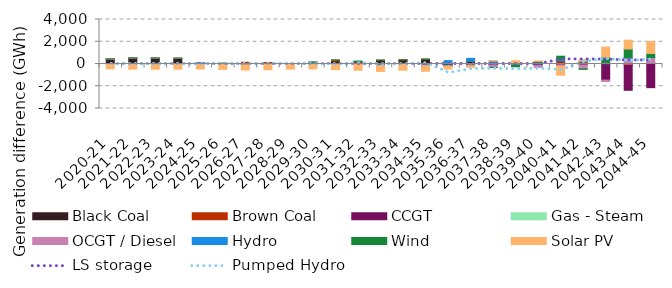
| Category | Black Coal | Brown Coal | CCGT | Gas - Steam | OCGT / Diesel | Hydro | Wind | Solar PV |
|---|---|---|---|---|---|---|---|---|
| 2020-21 | 455.042 | 0.575 | 0.001 | 0 | 0.795 | -4.125 | 0.005 | -427.634 |
| 2021-22 | 542.054 | 1.513 | 0.001 | 0 | 0.002 | -1.081 | 0.006 | -456.438 |
| 2022-23 | 522.702 | 0.621 | 0.639 | 0 | 3.698 | -2.58 | 0.006 | -468.389 |
| 2023-24 | 498.778 | 11.382 | 3.229 | 0.479 | 3.277 | -5.453 | 2.774 | -456.076 |
| 2024-25 | 92.994 | 24.4 | 2.553 | 3.693 | 1.015 | 2.212 | -2.887 | -444.594 |
| 2025-26 | 30.787 | 83.303 | -27.401 | 0.701 | -3.643 | -10.308 | -4.276 | -435.556 |
| 2026-27 | -24.76 | 154.974 | -23.341 | -1.49 | -8.385 | -8.872 | -6.165 | -468.572 |
| 2027-28 | 58.286 | 81.412 | -15.057 | -1.603 | -2.838 | -14.22 | -6.314 | -473.194 |
| 2028-29 | -1.189 | 10.32 | -22.922 | -2.989 | -10.386 | -0.858 | -3.553 | -420.658 |
| 2029-30 | 63.128 | 87.301 | -4.195 | -0.749 | -1.011 | 12.526 | 12.973 | -427.895 |
| 2030-31 | 249.584 | 95.382 | -4.76 | -8.129 | -3.683 | -34.336 | 22.366 | -456.437 |
| 2031-32 | 35.343 | 185.628 | -8.727 | -3.085 | -4.724 | 26.919 | 3.713 | -544.643 |
| 2032-33 | 318.449 | 20.614 | -21.39 | -4.001 | -5.439 | -109.237 | 23.52 | -528.382 |
| 2033-34 | 358.526 | 3.878 | -12.094 | -5.748 | -10.036 | -14.239 | 6.01 | -515.725 |
| 2034-35 | 421.954 | 2.983 | -43.704 | -12.596 | -29.95 | -60.578 | 20.912 | -505.548 |
| 2035-36 | -151.072 | 0 | -14.511 | -0.571 | -13.907 | 304.759 | -0.872 | -270.452 |
| 2036-37 | 277.039 | -28.315 | -8.344 | 16.407 | -75.786 | 212.96 | -36.179 | -151.575 |
| 2037-38 | 23.9 | -13.694 | -68.278 | 27.093 | -222.538 | 210.482 | -13.508 | 44.315 |
| 2038-39 | 9.883 | 5.216 | -65.868 | -2.234 | -32.416 | 115.954 | -154.508 | 164.888 |
| 2039-40 | 14.719 | -25.92 | -98.234 | 0 | -180.677 | 122.699 | 96.74 | 33.697 |
| 2040-41 | 20.046 | 271.5 | -76.477 | 0 | -109.979 | 138.302 | 269.557 | -823.088 |
| 2041-42 | 81.003 | 123.611 | -85.854 | 0 | -347.445 | 61.571 | -48.345 | 127.58 |
| 2042-43 | 27.619 | -7.916 | -1439.196 | 0 | -123.361 | 76.653 | 511.3 | 906.626 |
| 2043-44 | -40.759 | -91.372 | -2230.434 | 0 | 540.399 | 37.976 | 772.827 | 792.374 |
| 2044-45 | 62.933 | 45.131 | -2127.597 | 0 | 464.9 | 22.175 | 351.852 | 1070.804 |